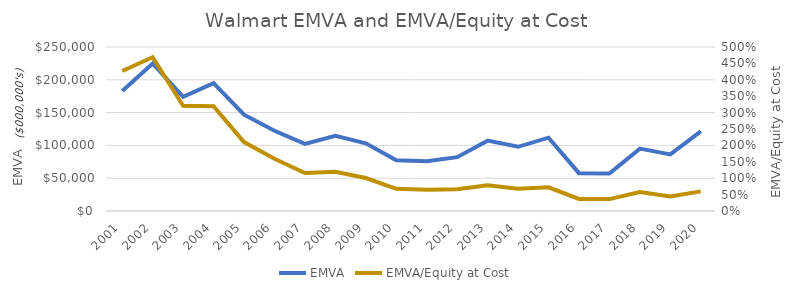
| Category | EMVA |
|---|---|
| 2001.0 | 182916.381 |
| 2002.0 | 224890.142 |
| 2003.0 | 173990.632 |
| 2004.0 | 194942.086 |
| 2005.0 | 146731.709 |
| 2006.0 | 122266.065 |
| 2007.0 | 102267.892 |
| 2008.0 | 114520.802 |
| 2009.0 | 103230.799 |
| 2010.0 | 77269.655 |
| 2011.0 | 75938.423 |
| 2012.0 | 82110.265 |
| 2013.0 | 107262.69 |
| 2014.0 | 97844.435 |
| 2015.0 | 111739.947 |
| 2016.0 | 57663.117 |
| 2017.0 | 57069.056 |
| 2018.0 | 95121.651 |
| 2019.0 | 86215.353 |
| 2020.0 | 121492.419 |